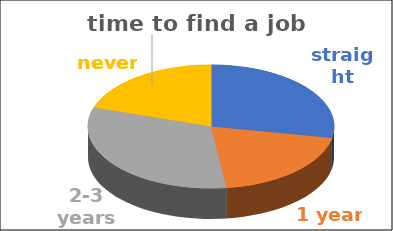
| Category | time to find a job | Series 1 | Series 2 | Series 3 | Series 4 |
|---|---|---|---|---|---|
| straight away | 0.28 |  |  |  |  |
| 1 year | 0.2 |  |  |  |  |
| 2-3 years | 0.32 |  |  |  |  |
| never | 0.2 |  |  |  |  |